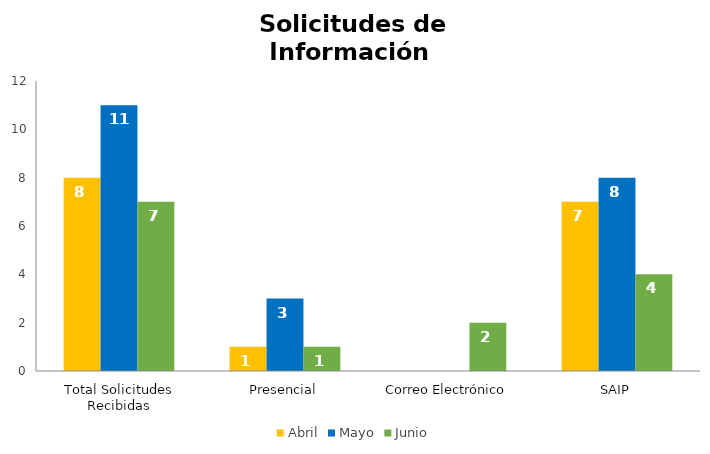
| Category | Abril | Mayo | Junio |
|---|---|---|---|
| Total Solicitudes Recibidas | 8 | 11 | 7 |
| Presencial | 1 | 3 | 1 |
| Correo Electrónico  | 0 | 0 | 2 |
| SAIP | 7 | 8 | 4 |